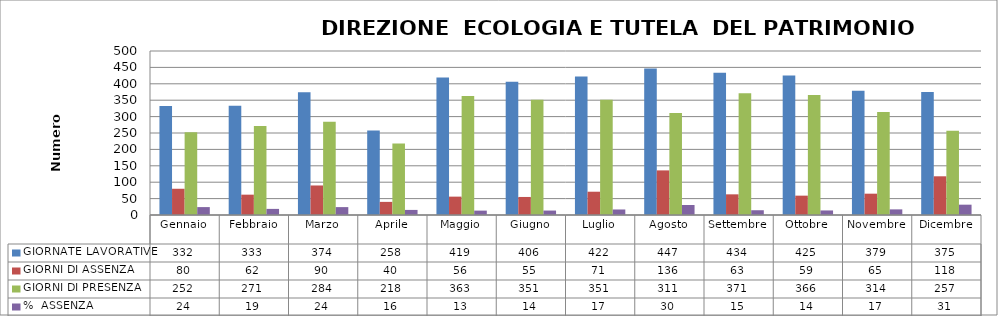
| Category | GIORNATE LAVORATIVE | GIORNI DI ASSENZA | GIORNI DI PRESENZA | %  ASSENZA |
|---|---|---|---|---|
| Gennaio | 332 | 80 | 252 | 24.096 |
| Febbraio | 333 | 62 | 271 | 18.619 |
| Marzo | 374 | 90 | 284 | 24.064 |
| Aprile | 258 | 40 | 218 | 15.504 |
| Maggio | 419 | 56 | 363 | 13.365 |
| Giugno | 406 | 55 | 351 | 13.547 |
| Luglio | 422 | 71 | 351 | 16.825 |
| Agosto | 447 | 136 | 311 | 30.425 |
| Settembre | 434 | 63 | 371 | 14.516 |
| Ottobre | 425 | 59 | 366 | 13.882 |
| Novembre | 379 | 65 | 314 | 17.15 |
| Dicembre | 375 | 118 | 257 | 31.467 |